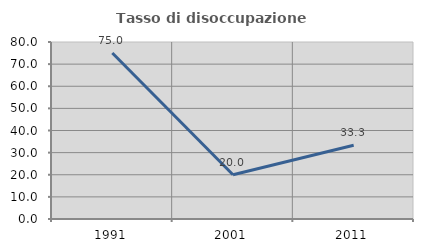
| Category | Tasso di disoccupazione giovanile  |
|---|---|
| 1991.0 | 75 |
| 2001.0 | 20 |
| 2011.0 | 33.333 |